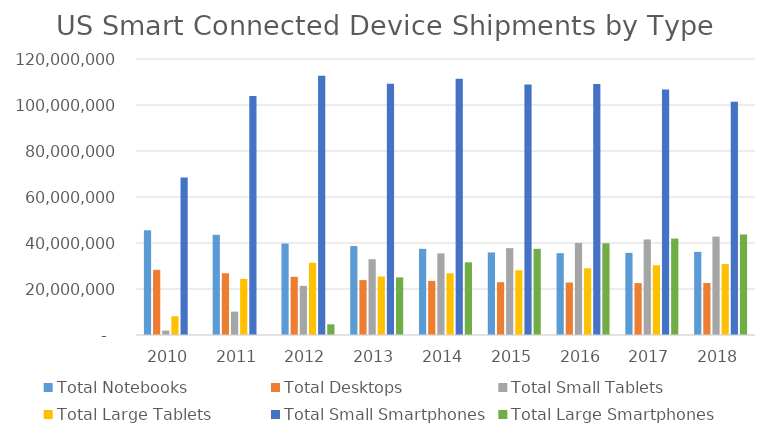
| Category | Total Notebooks | Total Desktops | Total Small Tablets | Total Large Tablets | Total Small Smartphones | Total Large Smartphones |
|---|---|---|---|---|---|---|
| 2010.0 | 45506757 | 28333888 | 1922085 | 8149884 | 68426680 | 694 |
| 2011.0 | 43559555 | 26839641 | 10169862 | 24383045 | 103916081 | 188 |
| 2012.0 | 39753288 | 25288326 | 21376081 | 31394653 | 112690839 | 4651467 |
| 2013.0 | 38663038 | 23867991 | 32948612 | 25427651 | 109253221 | 25046955 |
| 2014.0 | 37459693 | 23519974 | 35475600 | 26821528 | 111464701 | 31588465 |
| 2015.0 | 35889759 | 22964313 | 37763799 | 28134430 | 108957303 | 37473813 |
| 2016.0 | 35592296 | 22814301 | 40016604 | 29019387 | 109117244 | 39879118 |
| 2017.0 | 35714930 | 22568772 | 41536050 | 30324094 | 106742233 | 41938553 |
| 2018.0 | 36139637 | 22614525 | 42785401 | 30853977 | 101441950 | 43688413 |